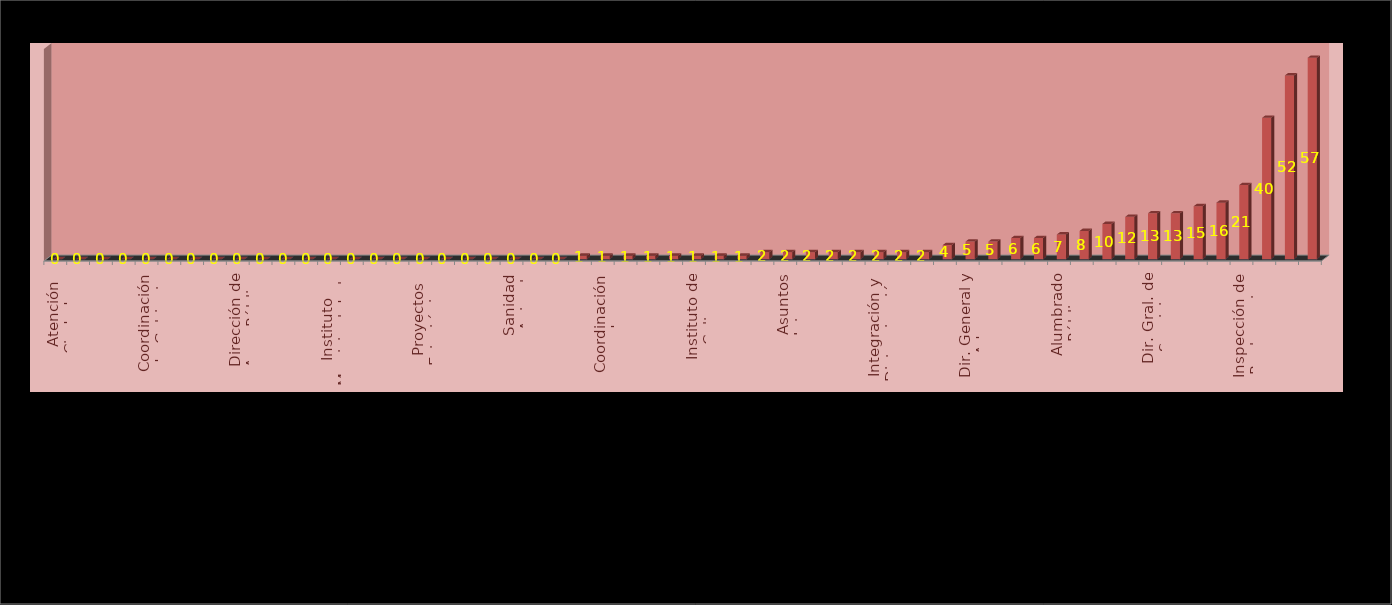
| Category | Series 0 | Series 1 |
|---|---|---|
| Atención Ciudadana |  | 0 |
| Consejeria Juridica |  | 0 |
| Contraloría |  | 0 |
| Coordinación de la Oficina de Presidencia  |  | 0 |
| Coordinación de Gabinete |  | 0 |
| Coordinación General  Oficina Central de Gobierno, Estrategía y opinión Pública |  | 0 |
| Coplademun |  | 0 |
| Dirección Catastro |  | 0 |
| Dirección de Aseo Público |  | 0 |
| Dirección de Cementerios |  | 0 |
| Dirección de Parques y Jardines |  | 0 |
| Dirección de Protección al Medio Ambiente |  | 0 |
| Instituto Municipal de la Juventud |  | 0 |
| Instituto Municipal de la Mujer |  | 0 |
| Junta Municipal de Reclutamiento |  | 0 |
| Mantenimiento de Pavimentos |  | 0 |
| Proyectos Estratégicos |  | 0 |
| Regidores |  | 0 |
| Registro Civil |  | 0 |
| Relaciones Exteriores |  | 0 |
| Sanidad Animal |  | 0 |
| Secretaria del Ayuntamiento |  | 0 |
| Vinculación Asuntos Religiosos |  | 0 |
| Comunidad Digna |  | 1 |
| Coordinación de Delegaciones |  | 1 |
| Dir. Gral. Innovación y Tecnología |  | 1 |
| Educación Municipal |  | 1 |
| Estacionómetros y Estacionamientos |  | 1 |
| Instituto de Cultura |  | 1 |
| Mantenimiento Urbano |  | 1 |
| Relaciones Públicas |  | 1 |
| Agua y Alcantarillado |  | 2 |
| Asuntos Internos |  | 2 |
| Comunicación Social |  | 2 |
| Dir. Gral. Promoción Económica y T. |  | 2 |
| Instituto de Capacitación y Oferta Educativa |  | 2 |
| Integración y Dictaminación |  | 2 |
| Rastros Municipales |  | 2 |
| Secretaría Particular |  | 2 |
| Dirección de Transparencia y Acceso a la Información |  | 4 |
| Dir. General y Admva. Ecología |  | 5 |
| Protección Civil y Bomberos |  | 5 |
| Participación Ciudadana |  | 6 |
| Patrimonio Municipal |  | 6 |
| Alumbrado Público |  | 7 |
| Archivo Municipal |  | 8 |
| Desarrollo Social Humano |  | 10 |
| Seguridad Pública |  | 12 |
| Dir. Gral. de Servicios Públicos |  | 13 |
| Síndico Municipal |  | 13 |
| Actas y Acuerdos |  | 15 |
| Padrón y Licencias |  | 16 |
| Inspección de Reglamentos |  | 21 |
| Tesorero Municipal |  | 40 |
| Obras Públicas |  | 52 |
| Oficialía Mayor Administrativa |  | 57 |